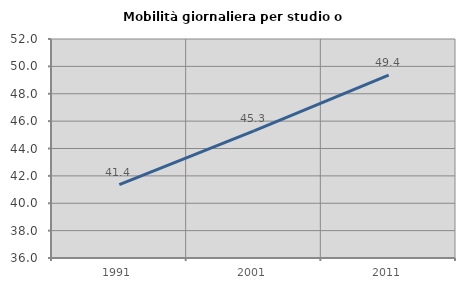
| Category | Mobilità giornaliera per studio o lavoro |
|---|---|
| 1991.0 | 41.362 |
| 2001.0 | 45.294 |
| 2011.0 | 49.366 |